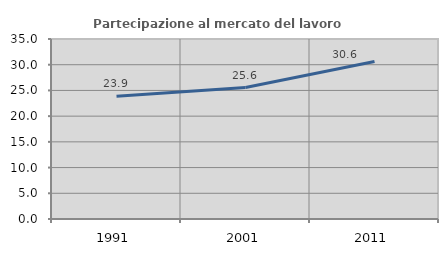
| Category | Partecipazione al mercato del lavoro  femminile |
|---|---|
| 1991.0 | 23.862 |
| 2001.0 | 25.56 |
| 2011.0 | 30.643 |